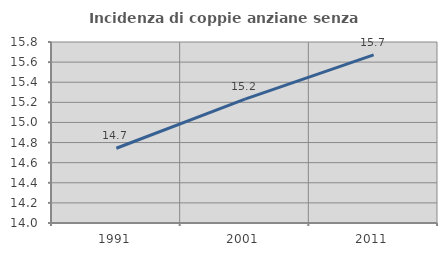
| Category | Incidenza di coppie anziane senza figli  |
|---|---|
| 1991.0 | 14.744 |
| 2001.0 | 15.232 |
| 2011.0 | 15.672 |